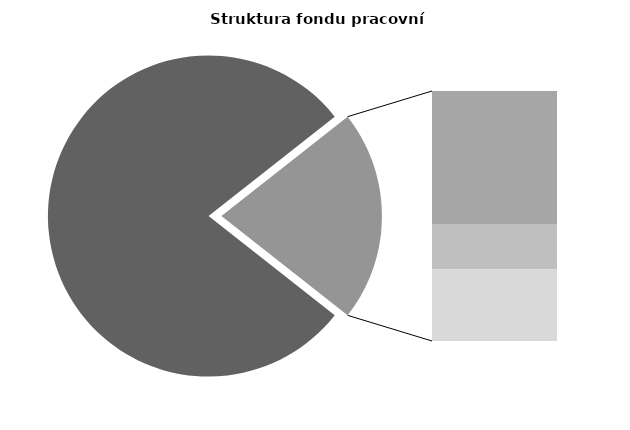
| Category | Series 0 |
|---|---|
| Průměrná měsíční odpracovaná doba bez přesčasu | 135.567 |
| Dovolená | 19.542 |
| Nemoc | 6.512 |
| Jiné | 10.482 |